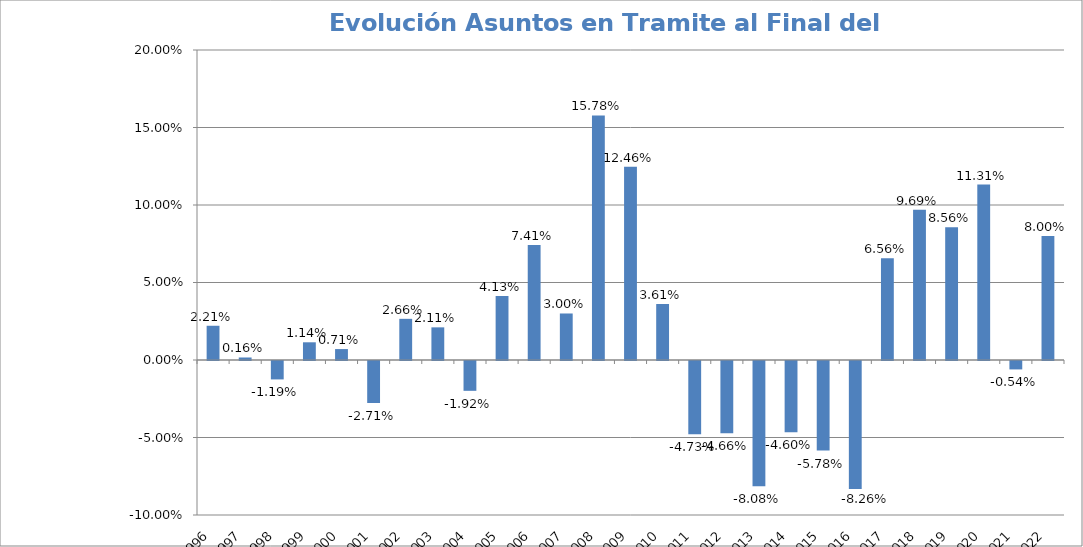
| Category | Evolución |
|---|---|
| 1996.0 | 0.022 |
| 1997.0 | 0.002 |
| 1998.0 | -0.012 |
| 1999.0 | 0.011 |
| 2000.0 | 0.007 |
| 2001.0 | -0.027 |
| 2002.0 | 0.027 |
| 2003.0 | 0.021 |
| 2004.0 | -0.019 |
| 2005.0 | 0.041 |
| 2006.0 | 0.074 |
| 2007.0 | 0.03 |
| 2008.0 | 0.158 |
| 2009.0 | 0.125 |
| 2010.0 | 0.036 |
| 2011.0 | -0.047 |
| 2012.0 | -0.047 |
| 2013.0 | -0.081 |
| 2014.0 | -0.046 |
| 2015.0 | -0.058 |
| 2016.0 | -0.083 |
| 2017.0 | 0.066 |
| 2018.0 | 0.097 |
| 2019.0 | 0.086 |
| 2020.0 | 0.113 |
| 2021.0 | -0.005 |
| 2022.0 | 0.08 |